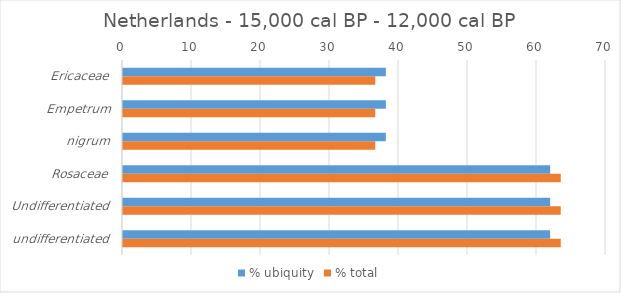
| Category | % ubiquity | % total |
|---|---|---|
| Ericaceae | 38.095 | 36.558 |
| Empetrum | 38.095 | 36.558 |
| nigrum | 38.095 | 36.558 |
| Rosaceae | 61.905 | 63.442 |
| Undifferentiated | 61.905 | 63.442 |
| undifferentiated | 61.905 | 63.442 |